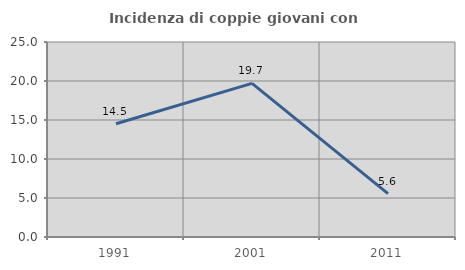
| Category | Incidenza di coppie giovani con figli |
|---|---|
| 1991.0 | 14.516 |
| 2001.0 | 19.697 |
| 2011.0 | 5.556 |